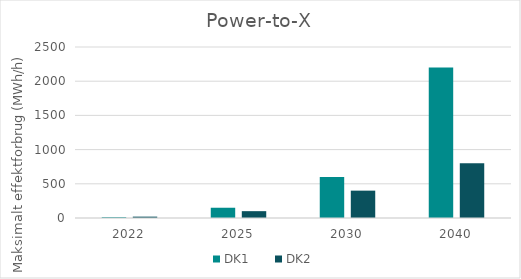
| Category | DK1 | DK2 |
|---|---|---|
| 2022.0 | 12 | 20 |
| 2025.0 | 150 | 100 |
| 2030.0 | 600 | 400 |
| 2040.0 | 2200 | 800 |